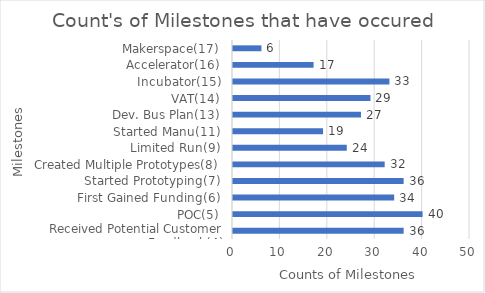
| Category | Count |
|---|---|
| Received Potential Customer Feedback(4) | 36 |
| POC(5) | 40 |
| First Gained Funding(6) | 34 |
| Started Prototyping(7) | 36 |
| Created Multiple Prototypes(8) | 32 |
| Limited Run(9) | 24 |
| Started Manu(11) | 19 |
| Dev. Bus Plan(13) | 27 |
|  VAT(14) | 29 |
| Incubator(15) | 33 |
| Accelerator(16) | 17 |
| Makerspace(17) | 6 |